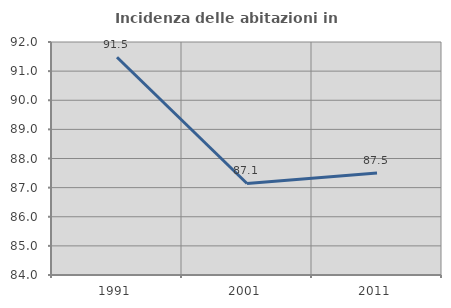
| Category | Incidenza delle abitazioni in proprietà  |
|---|---|
| 1991.0 | 91.477 |
| 2001.0 | 87.143 |
| 2011.0 | 87.5 |